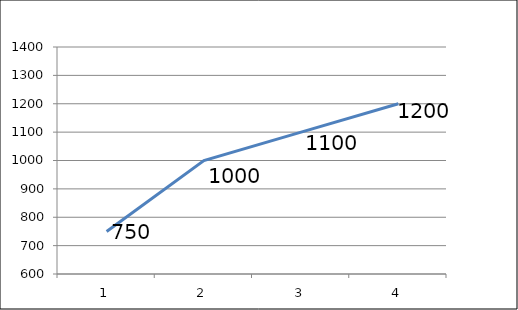
| Category | 16-dec-11 |
|---|---|
| 0 | 750 |
| 1 | 1000 |
| 2 | 1100 |
| 3 | 1200 |